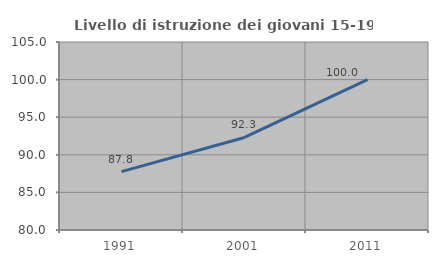
| Category | Livello di istruzione dei giovani 15-19 anni |
|---|---|
| 1991.0 | 87.77 |
| 2001.0 | 92.308 |
| 2011.0 | 100 |